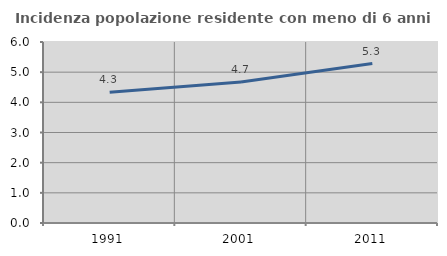
| Category | Incidenza popolazione residente con meno di 6 anni |
|---|---|
| 1991.0 | 4.333 |
| 2001.0 | 4.673 |
| 2011.0 | 5.284 |